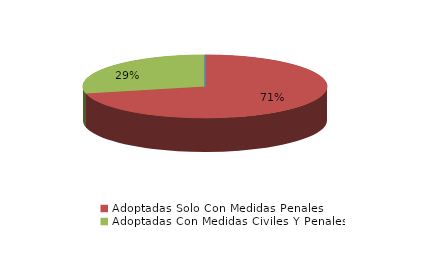
| Category | Series 0 |
|---|---|
| Denegadas | 0 |
| Adoptadas Solo Con Medidas Penales | 5 |
| Adoptadas Con Medidas Civiles Y Penales | 2 |
| Adoptadas Con Medidas Solo Civiles | 0 |